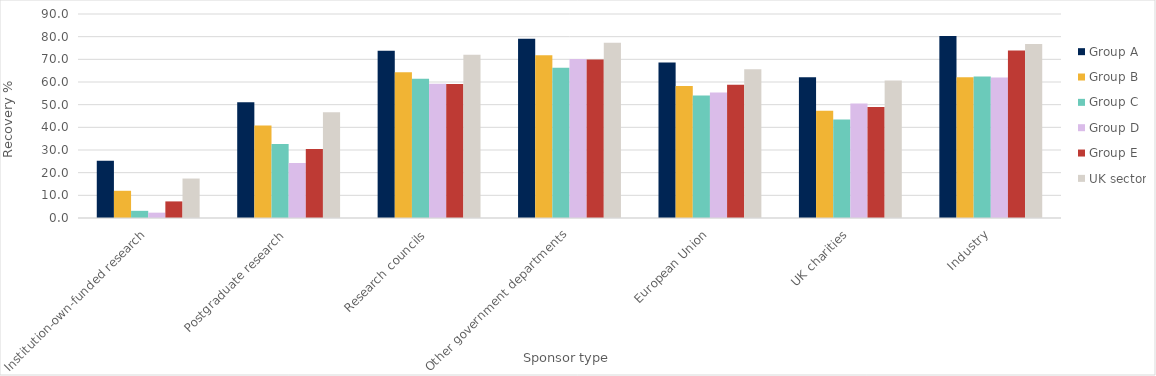
| Category | Group A | Group B | Group C | Group D | Group E | UK sector |
|---|---|---|---|---|---|---|
| Institution-own-funded research | 25.218 | 12.007 | 3.163 | 2.354 | 7.322 | 17.41 |
| Postgraduate research | 51.057 | 40.763 | 32.64 | 24.241 | 30.484 | 46.658 |
| Research councils | 73.838 | 64.299 | 61.476 | 59.278 | 59.078 | 72.011 |
| Other government departments | 79.082 | 71.83 | 66.252 | 70.193 | 69.933 | 77.281 |
| European Union | 68.621 | 58.19 | 54.038 | 55.418 | 58.766 | 65.587 |
| UK charities | 62.083 | 47.279 | 43.446 | 50.513 | 48.978 | 60.621 |
| Industry | 80.31 | 62.133 | 62.461 | 61.967 | 73.893 | 76.754 |